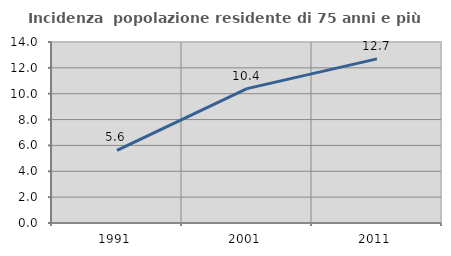
| Category | Incidenza  popolazione residente di 75 anni e più |
|---|---|
| 1991.0 | 5.616 |
| 2001.0 | 10.394 |
| 2011.0 | 12.697 |